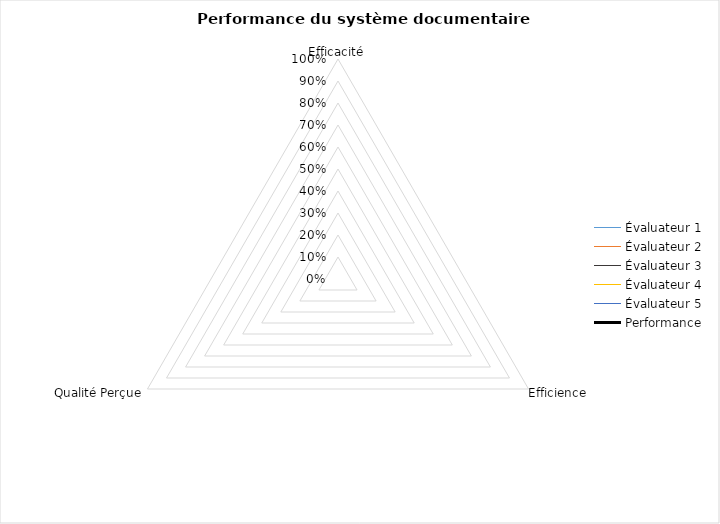
| Category | Évaluateur 1 | Évaluateur 2 | Évaluateur 3 | Évaluateur 4 | Évaluateur 5 | Performance |
|---|---|---|---|---|---|---|
| Efficacité | 0 | 0 | 0 | 0 | 0 | 0 |
| Efficience | 0 | 0 | 0 | 0 | 0 | 0 |
| Qualité Perçue | 0 | 0 | 0 | 0 | 0 | 0 |